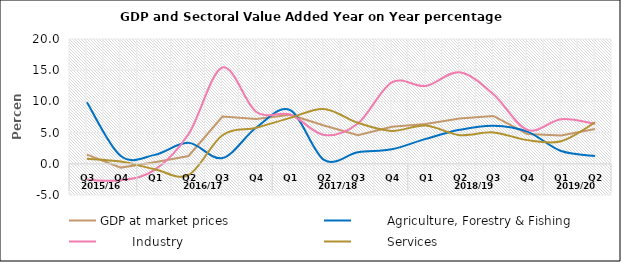
| Category | GDP at market prices |         Agriculture, Forestry & Fishing |         Industry |         Services |
|---|---|---|---|---|
| 0 | 1.461 | 9.867 | -2.573 | 0.797 |
| 1 | -0.61 | 1.238 | -2.63 | 0.351 |
| 2 | 0.262 | 1.433 | -0.985 | -0.872 |
| 3 | 1.25 | 3.353 | 4.773 | -1.795 |
| 4 | 7.574 | 0.922 | 15.441 | 4.575 |
| 5 | 7.164 | 5.809 | 8.3 | 5.782 |
| 6 | 7.849 | 8.613 | 7.891 | 7.356 |
| 7 | 6.133 | 0.629 | 4.623 | 8.793 |
| 8 | 4.584 | 1.845 | 6.466 | 6.567 |
| 9 | 5.926 | 2.318 | 13.063 | 5.27 |
| 10 | 6.361 | 3.994 | 12.48 | 6.148 |
| 11 | 7.273 | 5.443 | 14.667 | 4.59 |
| 12 | 7.677 | 6.113 | 11.138 | 5.03 |
| 13 | 4.791 | 5.16 | 5.433 | 3.795 |
| 14 | 4.538 | 2.045 | 7.143 | 3.618 |
| 15 | 5.583 | 1.253 | 6.412 | 6.634 |